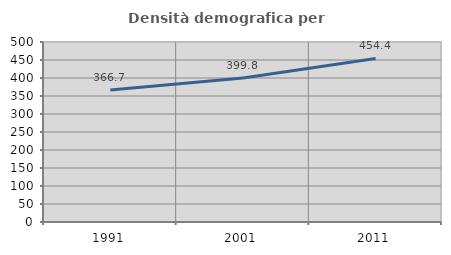
| Category | Densità demografica |
|---|---|
| 1991.0 | 366.729 |
| 2001.0 | 399.778 |
| 2011.0 | 454.388 |